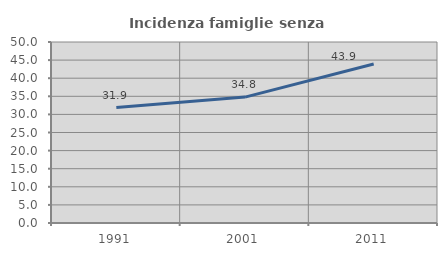
| Category | Incidenza famiglie senza nuclei |
|---|---|
| 1991.0 | 31.884 |
| 2001.0 | 34.783 |
| 2011.0 | 43.939 |